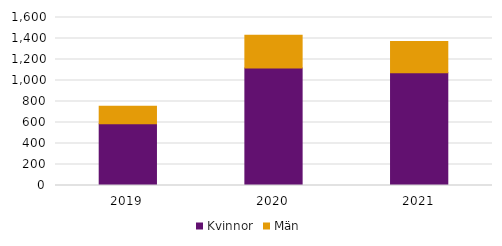
| Category | Kvinnor | Män |
|---|---|---|
| 2019.0 | 587 | 168 |
| 2020.0 | 1120 | 311 |
| 2021.0 | 1075 | 296 |